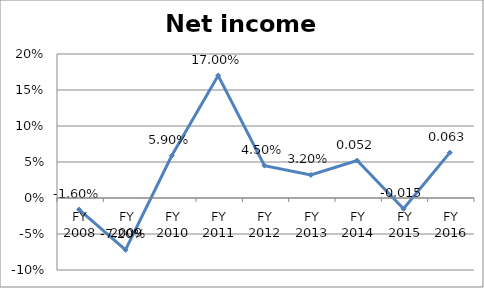
| Category | Net income ratio |
|---|---|
| FY 2016 | 0.063 |
| FY 2015 | -0.015 |
| FY 2014 | 0.052 |
| FY 2013 | 0.032 |
| FY 2012 | 0.045 |
| FY 2011 | 0.17 |
| FY 2010 | 0.059 |
| FY 2009 | -0.072 |
| FY 2008 | -0.016 |